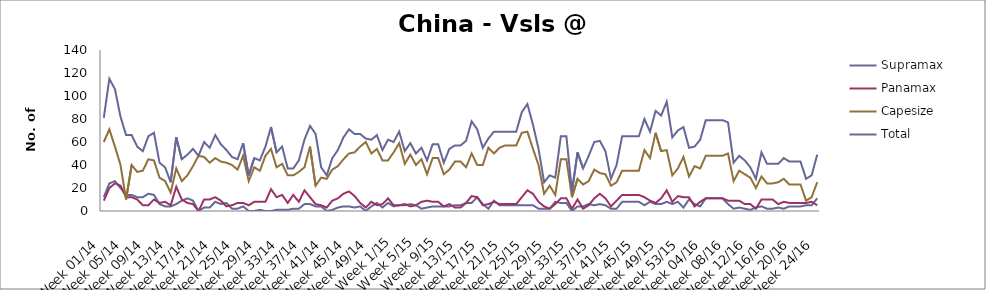
| Category | Supramax | Panamax | Capesize | Total |
|---|---|---|---|---|
| Week 01/14 | 12 | 9 | 60 | 81 |
| Week 02/14 | 24 | 20 | 71 | 115 |
| Week 03/14 | 26 | 24 | 56 | 106 |
| Week 04/14 | 20 | 22 | 40 | 82 |
| Week 05/14 | 14 | 12 | 10 | 66 |
| Week 06/14 | 14 | 12 | 40 | 66 |
| Week 07/14 | 12 | 10 | 34 | 56 |
| Week 08/14 | 12 | 5 | 35 | 52 |
| Week 09/14 | 15 | 5 | 45 | 65 |
| Week 10/14 | 14 | 10 | 44 | 68 |
| Week 11/14 | 6 | 7 | 29 | 42 |
| Week 12/14 | 4 | 8 | 26 | 38 |
| Week 13/14 | 4 | 5 | 16 | 25 |
| Week 14/14 | 6 | 21 | 37 | 64 |
| Week 15/14 | 9 | 10 | 26 | 45 |
| Week 16/14 | 11 | 7 | 31 | 49 |
| Week 17/14 | 9 | 6 | 39 | 54 |
| Week 18/14 | 0 | 0 | 48 | 48 |
| Week 19/14 | 3 | 10 | 47 | 60 |
| Week 20/14 | 3 | 10 | 42 | 55 |
| Week 21/14 | 8 | 12 | 46 | 66 |
| Week 22/14 | 6 | 9 | 43 | 58 |
| Week 23/14 | 7 | 4 | 42 | 53 |
| Week 24/14 | 2 | 5 | 40 | 47 |
| Week 25/14 | 2 | 7 | 36 | 45 |
| Week 26/14 | 4 | 7 | 48 | 59 |
| Week 27/14 | 0 | 5 | 26 | 31 |
| Week 28/14 | 0 | 8 | 38 | 46 |
| Week 29/14 | 1 | 8 | 35 | 44 |
| Week 30/14 | 0 | 8 | 48 | 56 |
| Week 31/14 | 0 | 19 | 54 | 73 |
| Week 32/14 | 1 | 12 | 38 | 51 |
| Week 33/14 | 1 | 14 | 41 | 56 |
| Week 34/14 | 1 | 7 | 31 | 37 |
| Week 35/14 | 2 | 14 | 31 | 37 |
| Week 36/14 | 2 | 8 | 34 | 44 |
| Week 37/14 | 6 | 18 | 38 | 62 |
| Week 38/14 | 6 | 12 | 56 | 74 |
| Week 39/14 | 4 | 6 | 22 | 67 |
| Week 40/14 | 4 | 5 | 29 | 38 |
| Week 41/14 | 0 | 3 | 28 | 31 |
| Week 42/14 | 1 | 9 | 36 | 46 |
| Week 43/14 | 3 | 11 | 39 | 53 |
| Week 44/14 | 4 | 15 | 45 | 64 |
| Week 45/14 | 4 | 17 | 50 | 71 |
| Week 46/14 | 3 | 13 | 51 | 67 |
| Week 47/14 | 4 | 7 | 56 | 67 |
| Week 48/14 | 0 | 3 | 60 | 63 |
| Week 49/14 | 4 | 8 | 50 | 62 |
| Week 50/14 | 7 | 5 | 54 | 66 |
| Week 51/14 | 3 | 6 | 44 | 53 |
| Week 52/14 | 7 | 11 | 44 | 62 |
| Week 1/15 | 4 | 5 | 51 | 60 |
| Week 2/15 | 5 | 5 | 59 | 69 |
| Week 3/15 | 5 | 6 | 41 | 52 |
| Week 4/15 | 6 | 4 | 49 | 59 |
| Week 5/15 | 5 | 5 | 40 | 50 |
| Week 6/15 | 2 | 8 | 45 | 55 |
| Week 7/15 | 3 | 9 | 32 | 44 |
| Week 8/15 | 4 | 8 | 46 | 58 |
| Week 9/15 | 4 | 8 | 46 | 58 |
| Week 10/15 | 4 | 4 | 32 | 42 |
| Week 11/15 | 4 | 6 | 36 | 54 |
| Week 12/15 | 5 | 3 | 43 | 57 |
| Week 13/15 | 5 | 3 | 43 | 57 |
| Week 14/15 | 7 | 7 | 38 | 61 |
| Week 15/15 | 7 | 13 | 50 | 78 |
| Week 16/15 | 12 | 12 | 40 | 71 |
| Week 17/15 | 6 | 5 | 40 | 55 |
| Week 18/15 | 2 | 6 | 55 | 63 |
| Week 19/15 | 9 | 8 | 50 | 69 |
| Week 20/15 | 5 | 6 | 55 | 69 |
| Week 21/15 | 5 | 6 | 57 | 69 |
| Week 22/15 | 5 | 6 | 57 | 69 |
| Week 23/15 | 5 | 6 | 57 | 69 |
| Week 24/15 | 5 | 12 | 68 | 86 |
| Week 25/15 | 5 | 18 | 69 | 93 |
| Week 26/15 | 5 | 15 | 54 | 75 |
| Week 27/15 | 2 | 8 | 40 | 54 |
| Week 28/15 | 2 | 4 | 15 | 25 |
| Week 29/15 | 2 | 2 | 22 | 31 |
| Week 30/15 | 8 | 6 | 14 | 29 |
| Week 31/15 | 7 | 11 | 45 | 65 |
| Week 32/15 | 7 | 11 | 45 | 65 |
| Week 33/15 | 0 | 2 | 12 | 17 |
| Week 34/15 | 4 | 10 | 28 | 51 |
| Week 35/15 | 4 | 2 | 23 | 37 |
| Week 36/15 | 6 | 5 | 26 | 48 |
| Week 37/15 | 5 | 11 | 36 | 60 |
| Week 38/15 | 6 | 15 | 33 | 61 |
| Week 39/15 | 5 | 11 | 32 | 52 |
| Week 40/15 | 2 | 4 | 22 | 28 |
| Week 41/15 | 2 | 9 | 25 | 40 |
| Week 42/15 | 8 | 14 | 35 | 65 |
| Week 43/15 | 8 | 14 | 35 | 65 |
| Week 44/15 | 8 | 14 | 35 | 65 |
| Week 45/15 | 8 | 14 | 35 | 65 |
| Week 46/15 | 5 | 12 | 53 | 80 |
| Week 47/15 | 8 | 9 | 46 | 69 |
| Week 48/15 | 6 | 7 | 68 | 87 |
| Week 49/15 | 6 | 11 | 52 | 83 |
| Week 50/15 | 8 | 18 | 53 | 95 |
| Week 51/15 | 6 | 8 | 31 | 64 |
| Week 52/15 | 8 | 13 | 37 | 70 |
| Week 53/15 | 3 | 12 | 47 | 73 |
| Week 01/16 | 10 | 12 | 30 | 55 |
| Week 02/16 | 6 | 4 | 39 | 56 |
| Week 03/16 | 4 | 8 | 37 | 62 |
| Week 04/16 | 11 | 11 | 48 | 79 |
| Week 05/16 | 11 | 11 | 48 | 79 |
| Week 06/16 | 11 | 11 | 48 | 79 |
| Week 07/16 | 11 | 11 | 48 | 79 |
| Week 08/16 | 6 | 9 | 50 | 77 |
| Week 09/16 | 2 | 9 | 26 | 42 |
| Week 10/16 | 3 | 9 | 35 | 48 |
| Week 11/16 | 2 | 6 | 32 | 44 |
| Week 12/16 | 1 | 6 | 29 | 38 |
| Week 13/16 | 3 | 2 | 20 | 28 |
| Week 14/16 | 4 | 10 | 30 | 51 |
| Week 15/16 | 2 | 10 | 24 | 41 |
| Week 16/16 | 2 | 10 | 24 | 41 |
| Week 17/16 | 3 | 6 | 25 | 41 |
| Week 18/16 | 2 | 8 | 28 | 46 |
| Week 19/16 | 4 | 7 | 23 | 43 |
| Week 20/16 | 4 | 7 | 23 | 43 |
| Week 21/16 | 4 | 7 | 23 | 43 |
| Week 22/16 | 5 | 7 | 9 | 28 |
| Week 23/16 | 5 | 8 | 12 | 31 |
| Week 24/16 | 11 | 5 | 25 | 49 |